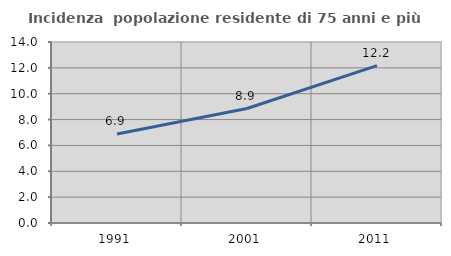
| Category | Incidenza  popolazione residente di 75 anni e più |
|---|---|
| 1991.0 | 6.882 |
| 2001.0 | 8.853 |
| 2011.0 | 12.17 |